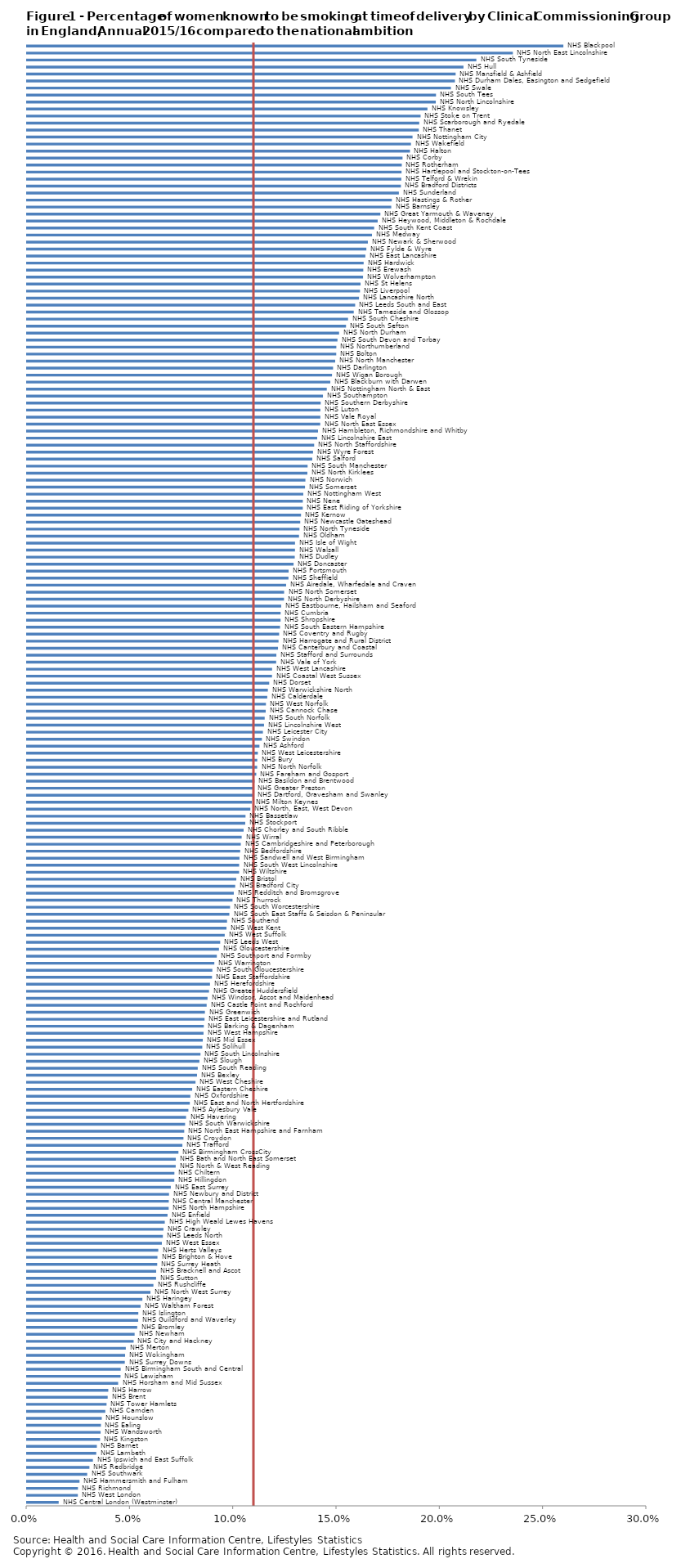
| Category | Series 0 |
|---|---|
| NHS Central London (Westminster)  | 0.015 |
| NHS West London | 0.025 |
| NHS Richmond  | 0.025 |
| NHS Hammersmith and Fulham  | 0.025 |
| NHS Southwark  | 0.029 |
| NHS Redbridge  | 0.03 |
| NHS Ipswich and East Suffolk  | 0.032 |
| NHS Lambeth  | 0.034 |
| NHS Barnet  | 0.034 |
| NHS Kingston  | 0.035 |
| NHS Wandsworth  | 0.036 |
| NHS Ealing  | 0.036 |
| NHS Hounslow  | 0.036 |
| NHS Camden  | 0.038 |
| NHS Tower Hamlets  | 0.039 |
| NHS Brent  | 0.039 |
| NHS Harrow  | 0.039 |
| NHS Horsham and Mid Sussex  | 0.044 |
| NHS Lewisham  | 0.045 |
| NHS Birmingham South and Central  | 0.045 |
| NHS Surrey Downs  | 0.047 |
| NHS Wokingham  | 0.048 |
| NHS Merton  | 0.048 |
| NHS City and Hackney  | 0.052 |
| NHS Newham  | 0.052 |
| NHS Bromley  | 0.053 |
| NHS Guildford and Waverley  | 0.054 |
| NHS Islington  | 0.054 |
| NHS Waltham Forest  | 0.055 |
| NHS Haringey  | 0.056 |
| NHS North West Surrey  | 0.06 |
| NHS Rushcliffe  | 0.061 |
| NHS Sutton  | 0.062 |
| NHS Bracknell and Ascot  | 0.063 |
| NHS Surrey Heath  | 0.063 |
| NHS Brighton & Hove  | 0.063 |
| NHS Herts Valleys  | 0.064 |
| NHS West Essex  | 0.065 |
| NHS Leeds North  | 0.066 |
| NHS Crawley  | 0.066 |
| NHS High Weald Lewes Havens  | 0.067 |
| NHS Enfield  | 0.068 |
| NHS North Hampshire  | 0.069 |
| NHS Central Manchester  | 0.069 |
| NHS Newbury and District  | 0.069 |
| NHS East Surrey  | 0.07 |
| NHS Hillingdon  | 0.071 |
| NHS Chiltern  | 0.071 |
| NHS North & West Reading  | 0.072 |
| NHS Bath and North East Somerset  | 0.072 |
| NHS Birmingham CrossCity  | 0.073 |
| NHS Trafford  | 0.075 |
| NHS Croydon  | 0.076 |
| NHS North East Hampshire and Farnham  | 0.076 |
| NHS South Warwickshire  | 0.077 |
| NHS Havering  | 0.077 |
| NHS Aylesbury Vale  | 0.078 |
| NHS East and North Hertfordshire  | 0.079 |
| NHS Oxfordshire  | 0.079 |
| NHS Eastern Cheshire  | 0.08 |
| NHS West Cheshire  | 0.082 |
| NHS Bexley  | 0.082 |
| NHS South Reading  | 0.083 |
| NHS Slough  | 0.083 |
| NHS South Lincolnshire  | 0.084 |
| NHS Solihull  | 0.085 |
| NHS Mid Essex  | 0.085 |
| NHS West Hampshire  | 0.085 |
| NHS Barking & Dagenham  | 0.086 |
| NHS East Leicestershire and Rutland  | 0.086 |
| NHS Greenwich  | 0.086 |
| NHS Castle Point and Rochford  | 0.087 |
| NHS Windsor, Ascot and Maidenhead  | 0.087 |
| NHS Greater Huddersfield  | 0.088 |
| NHS Herefordshire  | 0.089 |
| NHS East Staffordshire  | 0.09 |
| NHS South Gloucestershire  | 0.09 |
| NHS Warrington  | 0.091 |
| NHS Southport and Formby  | 0.092 |
| NHS Gloucestershire  | 0.093 |
| NHS Leeds West  | 0.094 |
| NHS West Suffolk  | 0.096 |
| NHS West Kent  | 0.097 |
| NHS Southend  | 0.097 |
| NHS South East Staffs & Seisdon & Peninsular  | 0.098 |
| NHS South Worcestershire  | 0.098 |
| NHS Thurrock  | 0.099 |
| NHS Redditch and Bromsgrove  | 0.1 |
| NHS Bradford City  | 0.101 |
| NHS Bristol  | 0.101 |
| NHS Wiltshire  | 0.103 |
| NHS South West Lincolnshire  | 0.103 |
| NHS Sandwell and West Birmingham  | 0.103 |
| NHS Bedfordshire  | 0.103 |
| NHS Cambridgeshire and Peterborough  | 0.104 |
| NHS Wirral  | 0.104 |
| NHS Chorley and South Ribble  | 0.105 |
| NHS Stockport  | 0.106 |
| NHS Bassetlaw  | 0.106 |
| NHS North, East, West Devon  | 0.108 |
| NHS Milton Keynes  | 0.109 |
| NHS Dartford, Gravesham and Swanley  | 0.109 |
| NHS Greater Preston  | 0.11 |
| NHS Basildon and Brentwood  | 0.11 |
| NHS Fareham and Gosport  | 0.111 |
| NHS North Norfolk  | 0.111 |
| NHS Bury  | 0.111 |
| NHS West Leicestershire  | 0.112 |
| NHS Ashford  | 0.113 |
| NHS Swindon  | 0.114 |
| NHS Leicester City  | 0.114 |
| NHS Lincolnshire West  | 0.115 |
| NHS South Norfolk  | 0.115 |
| NHS Cannock Chase  | 0.116 |
| NHS West Norfolk  | 0.116 |
| NHS Calderdale  | 0.116 |
| NHS Warwickshire North  | 0.117 |
| NHS Dorset  | 0.117 |
| NHS Coastal West Sussex  | 0.119 |
| NHS West Lancashire  | 0.119 |
| NHS Vale of York  | 0.121 |
| NHS Stafford and Surrounds  | 0.121 |
| NHS Canterbury and Coastal  | 0.122 |
| NHS Harrogate and Rural District  | 0.122 |
| NHS Coventry and Rugby  | 0.122 |
| NHS South Eastern Hampshire  | 0.123 |
| NHS Shropshire  | 0.123 |
| NHS Cumbria  | 0.123 |
| NHS Eastbourne, Hailsham and Seaford  | 0.123 |
| NHS North Derbyshire  | 0.124 |
| NHS North Somerset  | 0.124 |
| NHS Airedale, Wharfedale and Craven  | 0.125 |
| NHS Sheffield  | 0.127 |
| NHS Portsmouth  | 0.127 |
| NHS Doncaster  | 0.129 |
| NHS Dudley  | 0.13 |
| NHS Walsall  | 0.13 |
| NHS Isle of Wight  | 0.13 |
| NHS Oldham  | 0.132 |
| NHS North Tyneside  | 0.132 |
| NHS Newcastle Gateshead | 0.132 |
| NHS Kernow  | 0.133 |
| NHS East Riding of Yorkshire  | 0.134 |
| NHS Nene  | 0.134 |
| NHS Nottingham West  | 0.134 |
| NHS Somerset  | 0.135 |
| NHS Norwich  | 0.135 |
| NHS North Kirklees  | 0.136 |
| NHS South Manchester  | 0.136 |
| NHS Salford  | 0.138 |
| NHS Wyre Forest  | 0.138 |
| NHS North Staffordshire  | 0.139 |
| NHS Lincolnshire East  | 0.14 |
| NHS Hambleton, Richmondshire and Whitby  | 0.141 |
| NHS North East Essex  | 0.142 |
| NHS Vale Royal  | 0.142 |
| NHS Luton  | 0.142 |
| NHS Southern Derbyshire  | 0.142 |
| NHS Southampton  | 0.143 |
| NHS Nottingham North & East  | 0.145 |
| NHS Blackburn with Darwen  | 0.147 |
| NHS Wigan Borough  | 0.148 |
| NHS Darlington  | 0.148 |
| NHS North Manchester  | 0.149 |
| NHS Bolton  | 0.15 |
| NHS Northumberland  | 0.15 |
| NHS South Devon and Torbay  | 0.15 |
| NHS North Durham  | 0.151 |
| NHS South Sefton  | 0.154 |
| NHS South Cheshire  | 0.155 |
| NHS Tameside and Glossop  | 0.158 |
| NHS Leeds South and East  | 0.159 |
| NHS Lancashire North  | 0.161 |
| NHS Liverpool  | 0.161 |
| NHS St Helens  | 0.161 |
| NHS Wolverhampton  | 0.163 |
| NHS Erewash  | 0.163 |
| NHS Hardwick  | 0.163 |
| NHS East Lancashire  | 0.164 |
| NHS Fylde & Wyre  | 0.164 |
| NHS Newark & Sherwood  | 0.165 |
| NHS Medway  | 0.167 |
| NHS South Kent Coast  | 0.168 |
| NHS Heywood, Middleton & Rochdale  | 0.17 |
| NHS Great Yarmouth & Waveney  | 0.171 |
| NHS Barnsley  | 0.176 |
| NHS Hastings & Rother  | 0.177 |
| NHS Sunderland  | 0.18 |
| NHS Bradford Districts  | 0.181 |
| NHS Telford & Wrekin  | 0.181 |
| NHS Hartlepool and Stockton-on-Tees  | 0.181 |
| NHS Rotherham  | 0.181 |
| NHS Corby  | 0.182 |
| NHS Halton  | 0.185 |
| NHS Wakefield  | 0.186 |
| NHS Nottingham City  | 0.187 |
| NHS Thanet  | 0.19 |
| NHS Scarborough and Ryedale  | 0.19 |
| NHS Stoke on Trent  | 0.191 |
| NHS Knowsley  | 0.194 |
| NHS North Lincolnshire  | 0.198 |
| NHS South Tees  | 0.198 |
| NHS Swale  | 0.205 |
| NHS Durham Dales, Easington and Sedgefield  | 0.207 |
| NHS Mansfield & Ashfield  | 0.208 |
| NHS Hull  | 0.211 |
| NHS South Tyneside  | 0.218 |
| NHS North East Lincolnshire  | 0.235 |
| NHS Blackpool  | 0.26 |